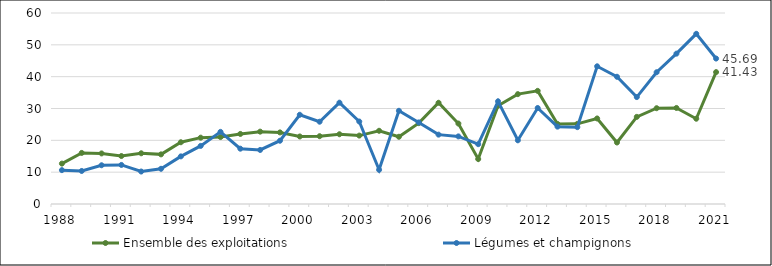
| Category | Ensemble des exploitations | Légumes et champignons |
|---|---|---|
| 1988 | 12.69 | 10.64 |
| 1989 | 16.05 | 10.38 |
| 1990 | 15.89 | 12.17 |
| 1991 | 15.07 | 12.27 |
| 1992 | 15.93 | 10.2 |
| 1993 | 15.59 | 11.06 |
| 1994 | 19.4 | 14.96 |
| 1995 | 20.84 | 18.25 |
| 1996 | 21.03 | 22.66 |
| 1997 | 22.01 | 17.38 |
| 1998 | 22.73 | 16.98 |
| 1999 | 22.49 | 19.88 |
| 2000 | 21.21 | 28.03 |
| 2001 | 21.3 | 25.85 |
| 2002 | 21.91 | 31.83 |
| 2003 | 21.49 | 25.91 |
| 2004 | 23 | 10.74 |
| 2005 | 21.12 | 29.28 |
| 2006 | 25.4 | 25.63 |
| 2007 | 31.8 | 21.79 |
| 2008 | 25.28 | 21.24 |
| 2009 | 14.12 | 18.79 |
| 2010 | 30.89 | 32.25 |
| 2011 | 34.51 | 20.01 |
| 2012 | 35.54 | 30.16 |
| 2013 | 25.15 | 24.3 |
| 2014 | 25.18 | 24.14 |
| 2015 | 26.87 | 43.26 |
| 2016 | 19.32 | 39.97 |
| 2017 | 27.37 | 33.59 |
| 2018 | 30.09 | 41.39 |
| 2019 | 30.17 | 47.23 |
| 2020 | 26.79 | 53.46 |
| 2021 | 41.43 | 45.69 |